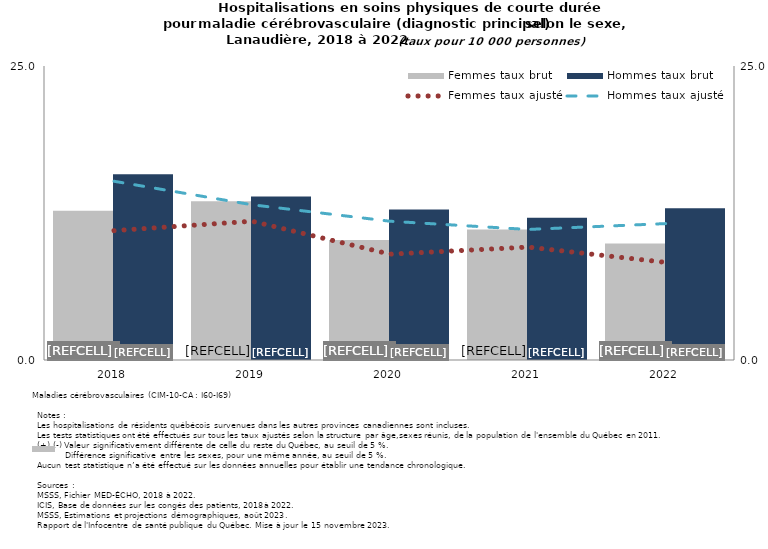
| Category | Femmes taux brut | Hommes taux brut |
|---|---|---|
| 2018.0 | 12.7 | 15.8 |
| 2019.0 | 13.5 | 13.9 |
| 2020.0 | 10.2 | 12.8 |
| 2021.0 | 11.1 | 12.1 |
| 2022.0 | 9.9 | 12.9 |